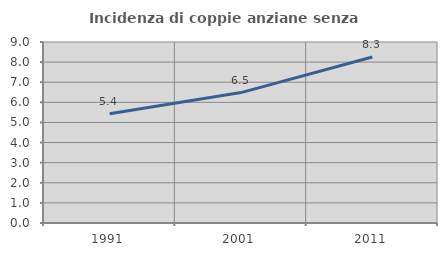
| Category | Incidenza di coppie anziane senza figli  |
|---|---|
| 1991.0 | 5.435 |
| 2001.0 | 6.485 |
| 2011.0 | 8.252 |